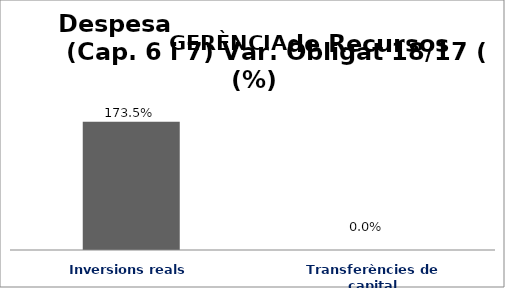
| Category | Series 0 |
|---|---|
| Inversions reals | 1.735 |
| Transferències de capital | 0 |